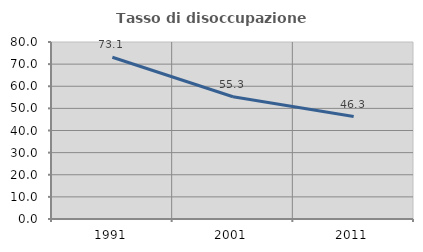
| Category | Tasso di disoccupazione giovanile  |
|---|---|
| 1991.0 | 73.108 |
| 2001.0 | 55.273 |
| 2011.0 | 46.304 |